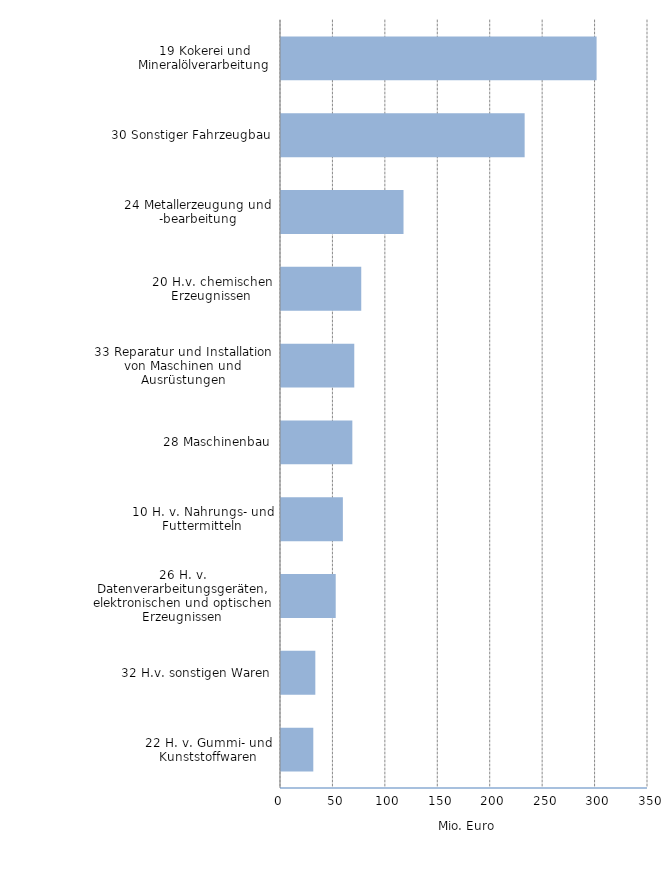
| Category | Mio. Euro |
|---|---|
| 22 H. v. Gummi- und Kunststoffwaren | 30.803 |
| 32 H.v. sonstigen Waren | 32.735 |
| 26 H. v. Datenverarbeitungsgeräten, elektronischen und optischen Erzeugnissen | 52.177 |
| 10 H. v. Nahrungs- und Futtermitteln | 59.005 |
| 28 Maschinenbau | 68.037 |
| 33 Reparatur und Installation von Maschinen und Ausrüstungen | 69.879 |
| 20 H.v. chemischen Erzeugnissen | 76.526 |
| 24 Metallerzeugung und -bearbeitung | 116.84 |
| 30 Sonstiger Fahrzeugbau | 232.359 |
| 19 Kokerei und Mineralölverarbeitung | 300.973 |